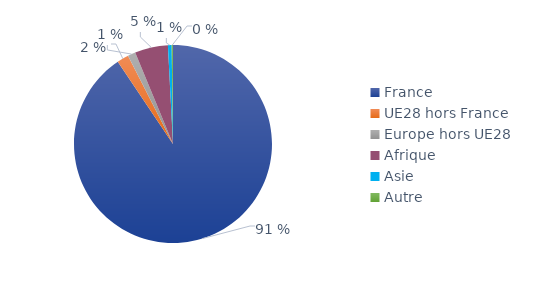
| Category | Series 0 |
|---|---|
| France | 0.906 |
| UE28 hors France | 0.019 |
| Europe hors UE28 | 0.013 |
| Afrique | 0.054 |
| Asie | 0.006 |
| Autre | 0.002 |